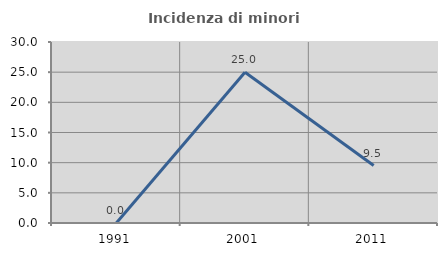
| Category | Incidenza di minori stranieri |
|---|---|
| 1991.0 | 0 |
| 2001.0 | 25 |
| 2011.0 | 9.524 |